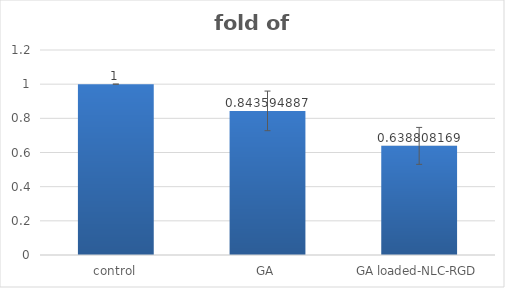
| Category | fold of control |
|---|---|
| control | 1 |
| GA | 0.844 |
| GA loaded-NLC-RGD | 0.639 |